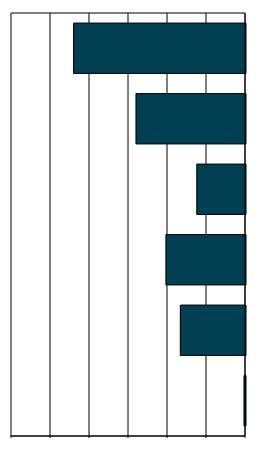
| Category | Series 0 |
|---|---|
| 0 | -0.068 |
| 1 | -3.339 |
| 2 | -4.074 |
| 3 | -2.491 |
| 4 | -5.609 |
| 5 | -8.812 |